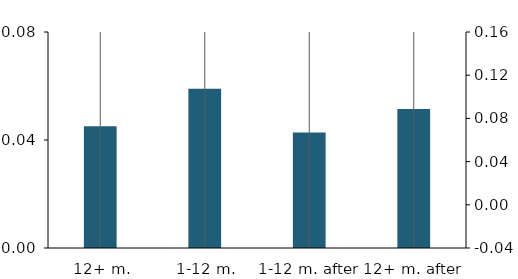
| Category | Series 0 |
|---|---|
| 12+ m. before | 0.045 |
| 1-12 m. before | 0.059 |
| 1-12 m. after | 0.043 |
| 12+ m. after | 0.051 |